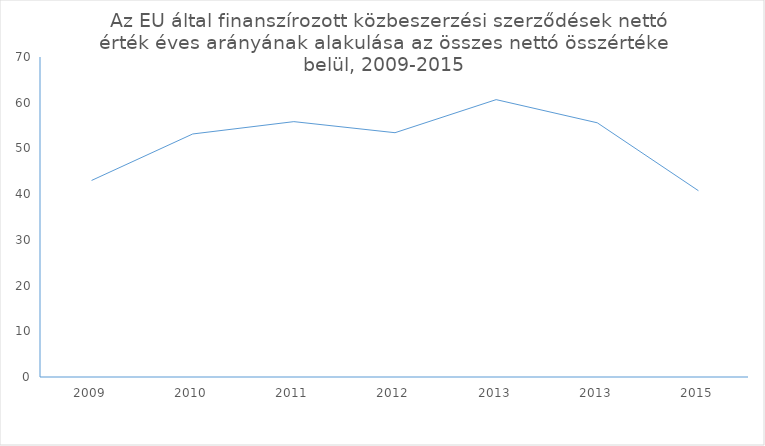
| Category | Series 0 |
|---|---|
| 2009.0 | 42.993 |
| 2010.0 | 53.163 |
| 2011.0 | 55.862 |
| 2012.0 | 53.44 |
| 2013.0 | 60.673 |
| 2013.0 | 55.606 |
| 2015.0 | 40.749 |